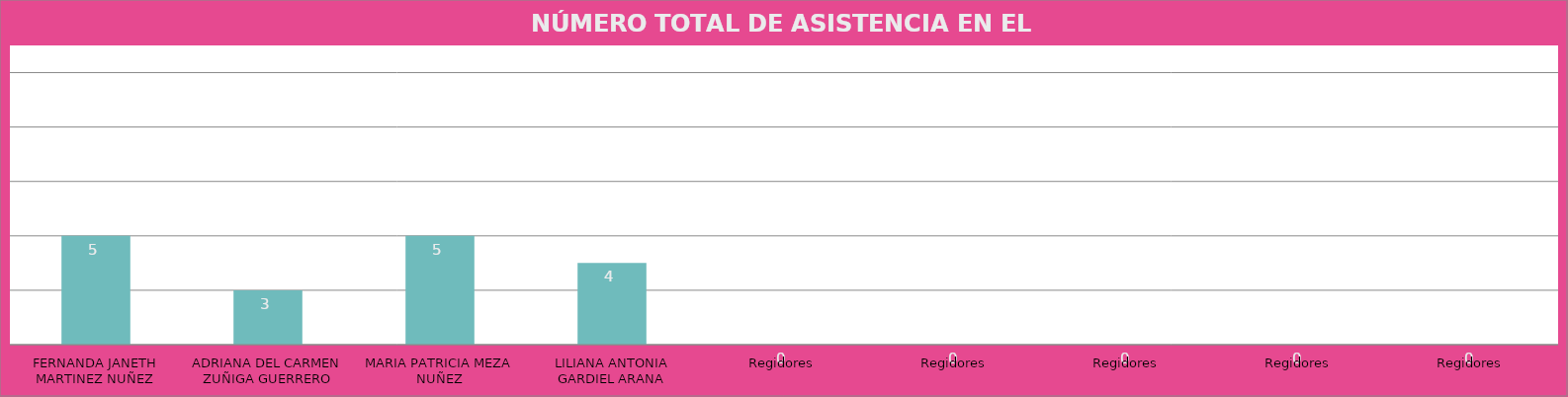
| Category | FERNANDA JANETH MARTINEZ NUÑEZ |
|---|---|
| FERNANDA JANETH MARTINEZ NUÑEZ | 5 |
| ADRIANA DEL CARMEN ZUÑIGA GUERRERO | 3 |
| MARIA PATRICIA MEZA NUÑEZ | 5 |
| LILIANA ANTONIA GARDIEL ARANA | 4 |
| Regidores | 0 |
| Regidores | 0 |
| Regidores | 0 |
| Regidores | 0 |
| Regidores | 0 |